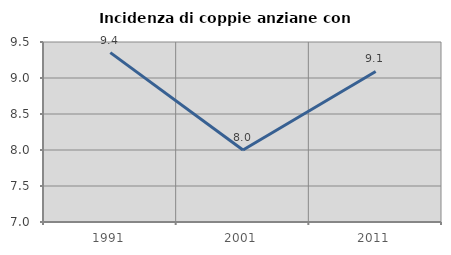
| Category | Incidenza di coppie anziane con figli |
|---|---|
| 1991.0 | 9.353 |
| 2001.0 | 8 |
| 2011.0 | 9.091 |